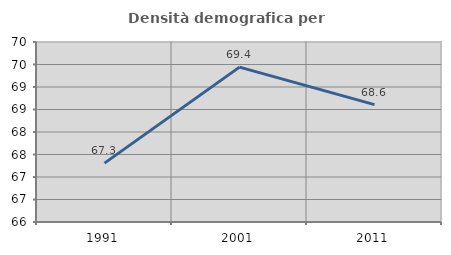
| Category | Densità demografica |
|---|---|
| 1991.0 | 67.308 |
| 2001.0 | 69.442 |
| 2011.0 | 68.609 |